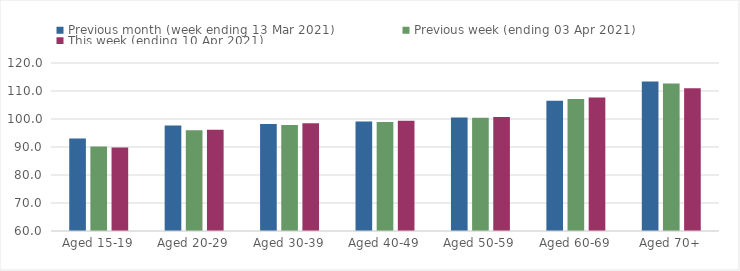
| Category | Previous month (week ending 13 Mar 2021) | Previous week (ending 03 Apr 2021) | This week (ending 10 Apr 2021) |
|---|---|---|---|
| Aged 15-19 | 93 | 90.17 | 89.8 |
| Aged 20-29 | 97.65 | 96 | 96.19 |
| Aged 30-39 | 98.25 | 97.83 | 98.48 |
| Aged 40-49 | 99.13 | 98.96 | 99.41 |
| Aged 50-59 | 100.56 | 100.43 | 100.68 |
| Aged 60-69 | 106.55 | 107.13 | 107.64 |
| Aged 70+ | 113.35 | 112.66 | 111.01 |